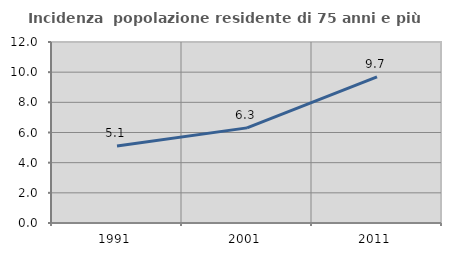
| Category | Incidenza  popolazione residente di 75 anni e più |
|---|---|
| 1991.0 | 5.103 |
| 2001.0 | 6.306 |
| 2011.0 | 9.692 |